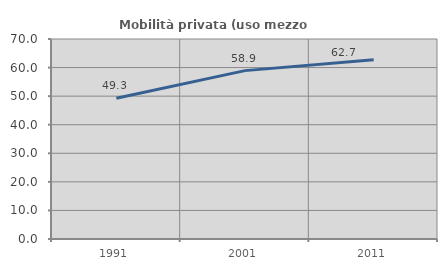
| Category | Mobilità privata (uso mezzo privato) |
|---|---|
| 1991.0 | 49.269 |
| 2001.0 | 58.931 |
| 2011.0 | 62.732 |